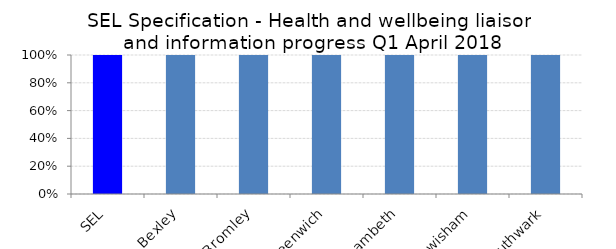
| Category | Health and wellbeing liaison and information |
|---|---|
| SEL | 1 |
| Bexley | 1 |
| Bromley | 1 |
| Greenwich | 1 |
| Lambeth | 1 |
| Lewisham | 1 |
| Southwark | 1 |